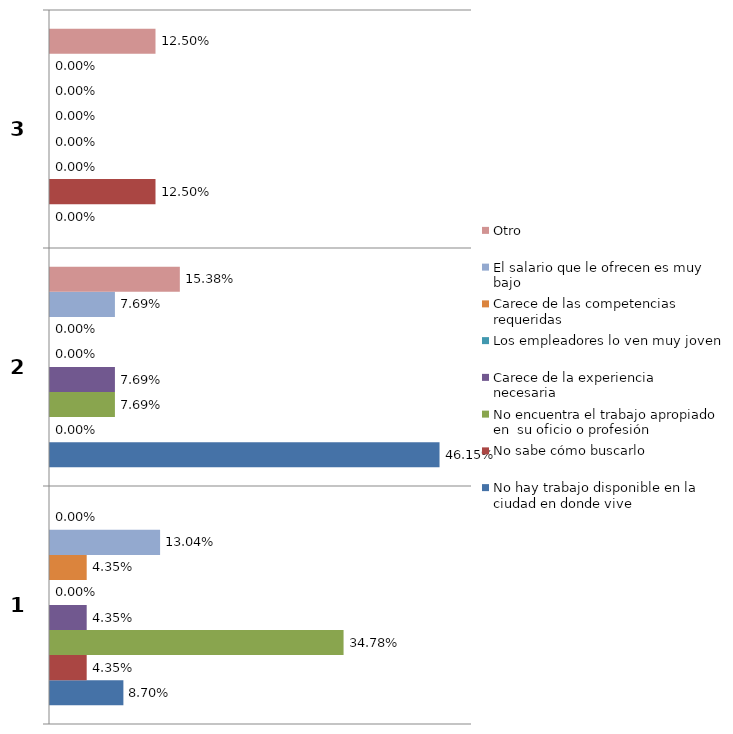
| Category | No hay trabajo disponible en la ciudad en donde vive  | No sabe cómo buscarlo  | No encuentra el trabajo apropiado en  su oficio o profesión   | Carece de la experiencia necesaria  | Los empleadores lo ven muy joven | Carece de las competencias requeridas  | El salario que le ofrecen es muy bajo | Otro |
|---|---|---|---|---|---|---|---|---|
| 0 | 0.087 | 0.043 | 0.348 | 0.043 | 0 | 0.043 | 0.13 | 0 |
| 1 | 0.462 | 0 | 0.077 | 0.077 | 0 | 0 | 0.077 | 0.154 |
| 2 | 0 | 0.125 | 0 | 0 | 0 | 0 | 0 | 0.125 |